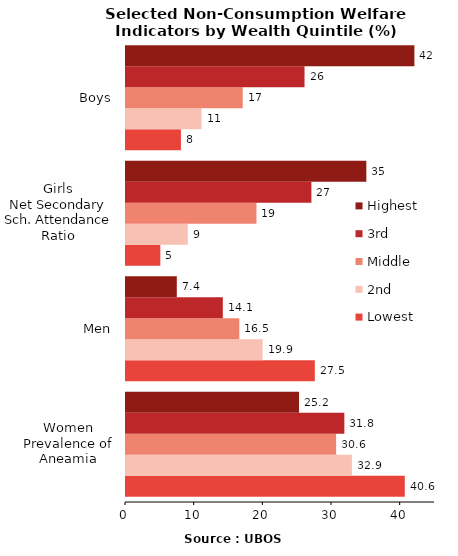
| Category | Lowest | 2nd | Middle | 3rd | Highest |
|---|---|---|---|---|---|
| 0 | 40.6 | 32.9 | 30.6 | 31.8 | 25.2 |
| 1 | 27.5 | 19.9 | 16.5 | 14.1 | 7.4 |
| 2 | 5 | 9 | 19 | 27 | 35 |
| 3 | 8 | 11 | 17 | 26 | 42 |